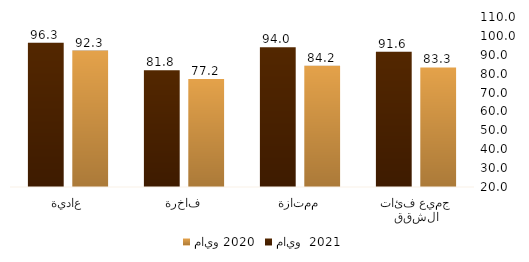
| Category | مايو 2020 | مايو  2021 |
|---|---|---|
| جميع فئات الشقق | 83.279 | 91.553 |
| ممتازة | 84.219 | 94.028 |
| فاخرة | 77.231 | 81.814 |
| عادية | 92.257 | 96.329 |